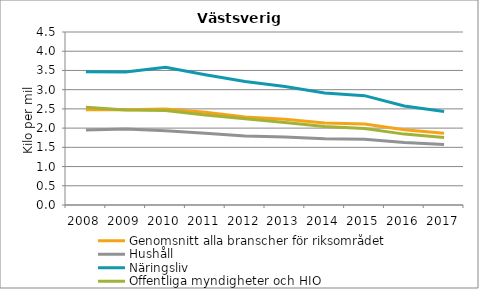
| Category | Genomsnitt alla branscher för riksområdet | Hushåll | Näringsliv | Offentliga myndigheter och HIO |
|---|---|---|---|---|
| 2008 | 2.476 | 1.949 | 3.469 | 2.545 |
| 2009 | 2.479 | 1.976 | 3.459 | 2.47 |
| 2010 | 2.496 | 1.934 | 3.58 | 2.46 |
| 2011 | 2.412 | 1.864 | 3.389 | 2.341 |
| 2012 | 2.292 | 1.792 | 3.21 | 2.241 |
| 2013 | 2.229 | 1.769 | 3.084 | 2.145 |
| 2014 | 2.135 | 1.722 | 2.914 | 2.043 |
| 2015 | 2.108 | 1.713 | 2.845 | 1.991 |
| 2016 | 1.955 | 1.627 | 2.574 | 1.844 |
| 2017 | 1.868 | 1.571 | 2.431 | 1.753 |